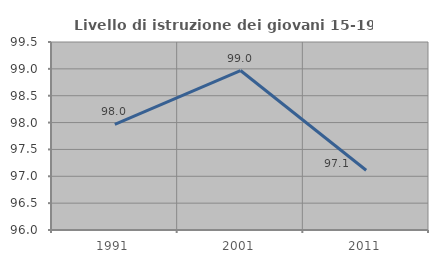
| Category | Livello di istruzione dei giovani 15-19 anni |
|---|---|
| 1991.0 | 97.964 |
| 2001.0 | 98.969 |
| 2011.0 | 97.112 |